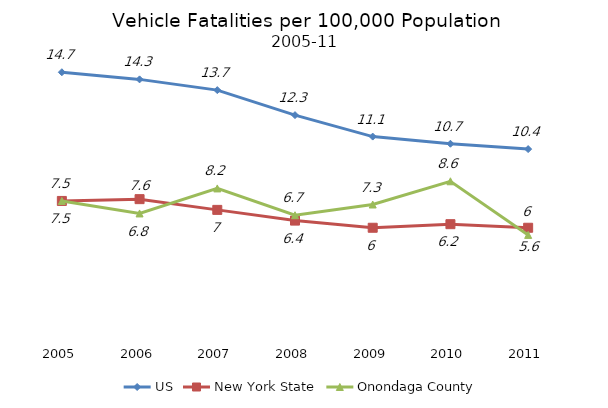
| Category | US | New York State | Onondaga County |
|---|---|---|---|
| 2005.0 | 14.7 | 7.5 | 7.5 |
| 2006.0 | 14.3 | 7.6 | 6.8 |
| 2007.0 | 13.7 | 7 | 8.2 |
| 2008.0 | 12.3 | 6.4 | 6.7 |
| 2009.0 | 11.1 | 6 | 7.3 |
| 2010.0 | 10.7 | 6.2 | 8.6 |
| 2011.0 | 10.4 | 6 | 5.6 |